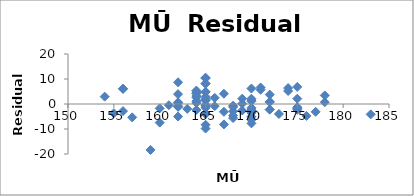
| Category | Series 0 |
|---|---|
| 165.0 | -1.523 |
| 167.0 | -8.173 |
| 161.0 | -0.469 |
| 170.0 | 1.11 |
| 160.0 | -1.754 |
| 164.0 | 5.378 |
| 156.0 | -2.83 |
| 163.0 | -1.956 |
| 178.0 | 3.419 |
| 170.0 | -2.58 |
| 165.0 | -0.732 |
| 175.0 | -2.299 |
| 168.0 | -4.629 |
| 165.0 | 1.699 |
| 169.0 | 2.136 |
| 177.0 | -3.129 |
| 165.0 | 10.268 |
| 170.0 | -7.752 |
| 175.0 | 6.826 |
| 162.0 | 0.417 |
| 168.0 | -2.893 |
| 167.0 | -3.131 |
| 170.0 | -2.543 |
| 164.0 | 4.24 |
| 165.0 | 1.394 |
| 164.0 | 2.629 |
| 170.0 | -1.543 |
| 162.0 | -1.098 |
| 170.0 | -2.543 |
| 172.0 | 0.933 |
| 162.0 | -0.889 |
| 167.0 | 4.091 |
| 164.0 | 4.85 |
| 172.0 | -2.235 |
| 178.0 | 0.719 |
| 172.0 | 0.765 |
| 165.0 | -0.301 |
| 168.0 | -0.671 |
| 160.0 | -7.448 |
| 168.0 | -5.629 |
| 165.0 | 10.532 |
| 169.0 | -2.608 |
| 165.0 | 2.921 |
| 164.0 | 1.161 |
| 162.0 | -5.014 |
| 170.0 | 6.194 |
| 164.0 | 3.198 |
| 162.0 | 0.685 |
| 165.0 | -3.781 |
| 172.0 | 3.77 |
| 170.0 | 1.588 |
| 155.0 | -3.691 |
| 162.0 | 3.944 |
| 170.0 | -3.543 |
| 174.0 | 5.199 |
| 165.0 | -3.69 |
| 168.0 | -1.198 |
| 157.0 | -5.341 |
| 154.0 | 2.945 |
| 183.0 | -4.141 |
| 164.0 | 0.419 |
| 165.0 | -9.823 |
| 156.0 | 6.115 |
| 169.0 | 0.128 |
| 175.0 | 2.136 |
| 175.0 | -1.295 |
| 172.0 | -2.23 |
| 165.0 | -8.296 |
| 173.0 | -3.98 |
| 165.0 | -4.087 |
| 166.0 | -0.841 |
| 165.0 | 1.879 |
| 171.0 | 5.695 |
| 164.0 | -2.359 |
| 171.0 | 6.611 |
| 159.0 | -18.381 |
| 170.0 | -6.321 |
| 170.0 | 2.115 |
| 174.0 | 6.372 |
| 162.0 | 8.68 |
| 166.0 | 2.457 |
| 164.0 | 4.336 |
| 156.0 | 6.032 |
| 176.0 | -4.756 |
| 165.0 | 4.837 |
| 175.0 | -1.738 |
| 165.0 | 8.135 |
| 165.0 | 4.884 |
| 165.0 | 8.177 |
| 162.0 | -1.098 |
| 170.0 | -5.058 |